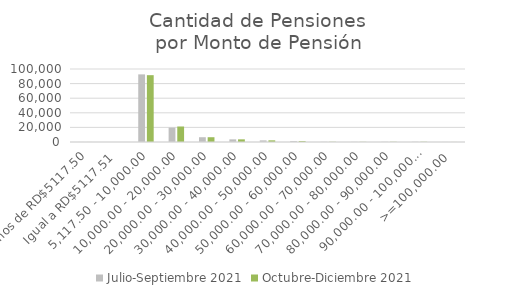
| Category | Julio-Septiembre 2021 | Octubre-Diciembre 2021 |
|---|---|---|
| Menos de RD$5117.50 | 45 | 44 |
| Igual a RD$5117.51 | 1 | 1 |
| 5,117.50 - 10,000.00 | 92637 | 91543 |
| 10,000.00 - 20,000.00 | 19649 | 21220 |
| 20,000.00 - 30,000.00 | 6559 | 6548 |
| 30,000.00 - 40,000.00 | 3631 | 3632 |
| 40,000.00 - 50,000.00 | 2221 | 2268 |
| 50,000.00 - 60,000.00 | 1221 | 1235 |
| 60,000.00 - 70,000.00 | 264 | 278 |
| 70,000.00 - 80,000.00 | 185 | 200 |
| 80,000.00 - 90,000.00 | 254 | 285 |
| 90,000.00 - 100,000.00 | 299 | 299 |
| >=100,000.00 | 47 | 51 |